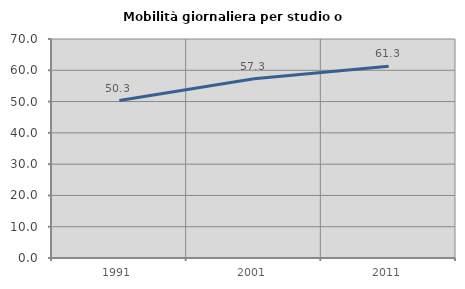
| Category | Mobilità giornaliera per studio o lavoro |
|---|---|
| 1991.0 | 50.325 |
| 2001.0 | 57.27 |
| 2011.0 | 61.312 |